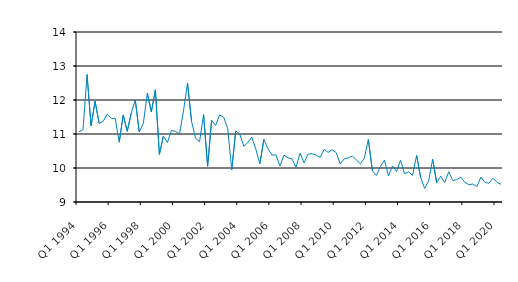
| Category | Series 0 |
|---|---|
| Q1 1994 | 11.067 |
| Q2 1994 | 11.129 |
| Q3 1994 | 12.75 |
| Q4 1994 | 11.238 |
| Q1 1995 | 11.961 |
| Q2 1995 | 11.316 |
| Q3 1995 | 11.37 |
| Q4 1995 | 11.583 |
| Q1 1996 | 11.46 |
| Q2 1996 | 11.458 |
| Q3 1996 | 10.759 |
| Q4 1996 | 11.56 |
| Q1 1997 | 11.08 |
| Q2 1997 | 11.616 |
| Q3 1997 | 12 |
| Q4 1997 | 11.059 |
| Q1 1998 | 11.312 |
| Q2 1998 | 12.199 |
| Q3 1998 | 11.649 |
| Q4 1998 | 12.3 |
| Q1 1999 | 10.4 |
| Q2 1999 | 10.939 |
| Q3 1999 | 10.75 |
| Q4 1999 | 11.1 |
| Q1 2000 | 11.08 |
| Q2 2000 | 11 |
| Q3 2000 | 11.679 |
| Q4 2000 | 12.5 |
| Q1 2001 | 11.375 |
| Q2 2001 | 10.875 |
| Q3 2001 | 10.775 |
| Q4 2001 | 11.57 |
| Q1 2002 | 10.05 |
| Q2 2002 | 11.405 |
| Q3 2002 | 11.25 |
| Q4 2002 | 11.566 |
| Q1 2003 | 11.492 |
| Q2 2003 | 11.162 |
| Q3 2003 | 9.95 |
| Q4 2003 | 11.091 |
| Q1 2004 | 11 |
| Q2 2004 | 10.638 |
| Q3 2004 | 10.75 |
| Q4 2004 | 10.908 |
| Q1 2005 | 10.55 |
| Q2 2005 | 10.125 |
| Q3 2005 | 10.843 |
| Q4 2005 | 10.573 |
| Q1 2006 | 10.38 |
| Q2 2006 | 10.387 |
| Q3 2006 | 10.06 |
| Q4 2006 | 10.38 |
| Q1 2007 | 10.3 |
| Q2 2007 | 10.27 |
| Q3 2007 | 10.017 |
| Q4 2007 | 10.44 |
| Q1 2008 | 10.15 |
| Q2 2008 | 10.41 |
| Q3 2008 | 10.42 |
| Q4 2008 | 10.38 |
| Q1 2009 | 10.31 |
| Q2 2009 | 10.55 |
| Q3 2009 | 10.46 |
| Q4 2009 | 10.54 |
| Q1 2010 | 10.45 |
| Q2 2010 | 10.12 |
| Q3 2010 | 10.27 |
| Q4 2010 | 10.3 |
| Q1 2011 | 10.35 |
| Q2 2011 | 10.24 |
| Q3 2011 | 10.125 |
| Q4 2011 | 10.29 |
| Q1 2012 | 10.84 |
| Q2 2012 | 9.92 |
| Q3 2012 | 9.78 |
| Q4 2012 | 10.05 |
| Q1 2013 | 10.23 |
| Q2 2013 | 9.77 |
| Q3 2013 | 10.06 |
| Q4 2013 | 9.9 |
| Q1 2014 | 10.23 |
| Q2 2014 | 9.83 |
| Q3 2014 | 9.89 |
| Q4 2014 | 9.78 |
| Q1 2015 | 10.37 |
| Q2 2015 | 9.726 |
| Q3 2015 | 9.4 |
| Q4 2015 | 9.62 |
| Q1 2016 | 10.26 |
| Q2 2016 | 9.57 |
| Q3 2016 | 9.76 |
| Q4 2016 | 9.57 |
| Q1 2017 | 9.89 |
| Q2 2017 | 9.63 |
| Q3 2017 | 9.66 |
| Q4 2017 | 9.73 |
| Q1 2018 | 9.58 |
| Q2 2018 | 9.51 |
| Q3 2018 | 9.53 |
| Q4 2018 | 9.45 |
| Q1 2019 | 9.73 |
| Q2 2019 | 9.58 |
| Q3 2019 | 9.55 |
| Q4 2019 | 9.7 |
| Q1 2020 | 9.58 |
| Q2 2020 | 9.52 |